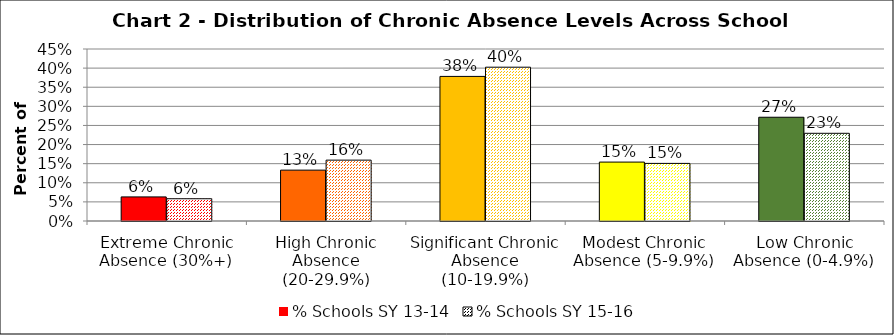
| Category | % Schools SY 13-14 | % Schools SY 15-16 |
|---|---|---|
| Extreme Chronic Absence (30%+) | 0.063 | 0.058 |
| High Chronic Absence (20-29.9%) | 0.133 | 0.159 |
| Significant Chronic Absence (10-19.9%) | 0.378 | 0.402 |
| Modest Chronic Absence (5-9.9%) | 0.154 | 0.151 |
| Low Chronic Absence (0-4.9%) | 0.271 | 0.229 |